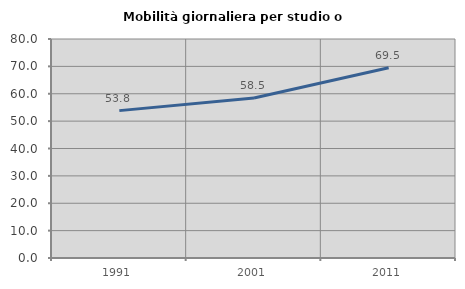
| Category | Mobilità giornaliera per studio o lavoro |
|---|---|
| 1991.0 | 53.834 |
| 2001.0 | 58.453 |
| 2011.0 | 69.476 |